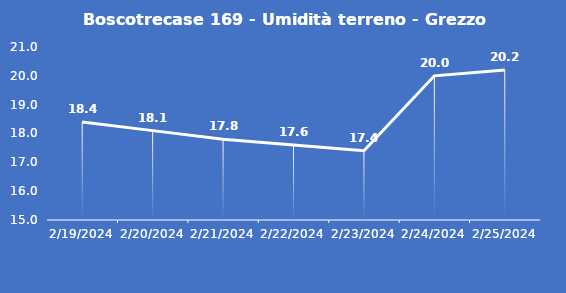
| Category | Boscotrecase 169 - Umidità terreno - Grezzo (%VWC) |
|---|---|
| 2/19/24 | 18.4 |
| 2/20/24 | 18.1 |
| 2/21/24 | 17.8 |
| 2/22/24 | 17.6 |
| 2/23/24 | 17.4 |
| 2/24/24 | 20 |
| 2/25/24 | 20.2 |